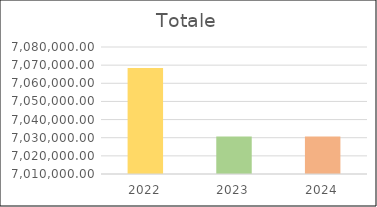
| Category | Series 0 |
|---|---|
| 2022.0 | 7068362 |
| 2023.0 | 7030612 |
| 2024.0 | 7030612 |